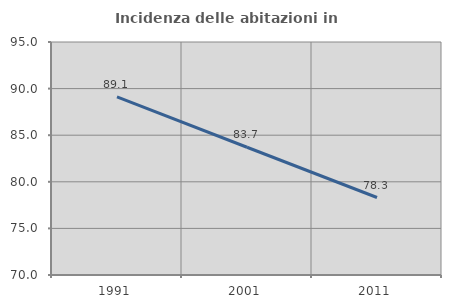
| Category | Incidenza delle abitazioni in proprietà  |
|---|---|
| 1991.0 | 89.119 |
| 2001.0 | 83.708 |
| 2011.0 | 78.313 |